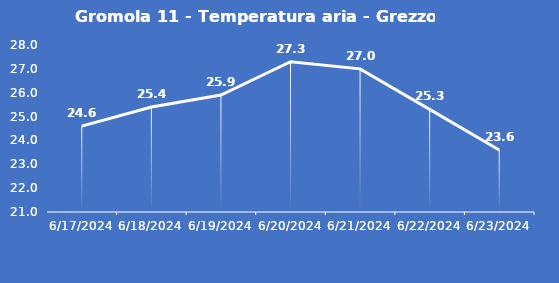
| Category | Gromola 11 - Temperatura aria - Grezzo (°C) |
|---|---|
| 6/17/24 | 24.6 |
| 6/18/24 | 25.4 |
| 6/19/24 | 25.9 |
| 6/20/24 | 27.3 |
| 6/21/24 | 27 |
| 6/22/24 | 25.3 |
| 6/23/24 | 23.6 |